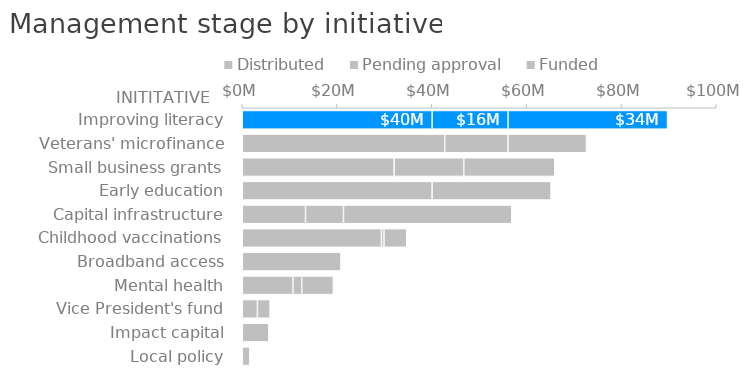
| Category | Distributed | Pending approval | Funded |
|---|---|---|---|
| Improving literacy | 40.05 | 16.02 | 33.642 |
| Veterans' microfinance | 42.72 | 13.35 | 16.554 |
| Small business grants | 32.04 | 14.685 | 19.224 |
| Early education | 40.05 | 0 | 25.098 |
| Capital infrastructure | 13.35 | 8.01 | 35.511 |
| Childhood vaccinations | 29.37 | 0.534 | 4.806 |
| Broadband access | 20.826 | 0 | 0 |
| Mental health | 10.68 | 1.869 | 6.675 |
| Vice President's fund | 3.204 | 2.67 | 0 |
| Impact capital | 5.607 | 0 | 0 |
| Local policy | 1.602 | 0 | 0 |